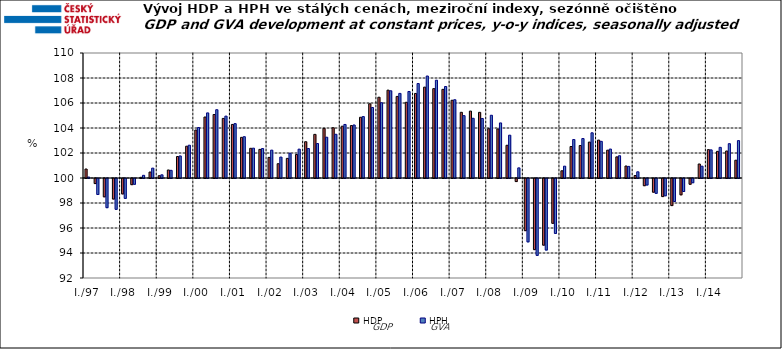
| Category | HDP

 | HPH

 |
|---|---|---|
| I./97 | 100.719 | 100.078 |
|  | 99.595 | 98.722 |
|  | 98.534 | 97.665 |
|  | 98.357 | 97.533 |
| I./98 | 98.767 | 98.409 |
|  | 99.507 | 99.536 |
|  | 100.056 | 100.215 |
|  | 100.477 | 100.79 |
| I./99 | 100.184 | 100.255 |
|  | 100.641 | 100.613 |
|  | 101.719 | 101.764 |
|  | 102.543 | 102.623 |
| I./00 | 103.839 | 104.038 |
|  | 104.879 | 105.209 |
|  | 105.081 | 105.463 |
|  | 104.766 | 104.949 |
| I./01 | 104.286 | 104.349 |
|  | 103.251 | 103.304 |
|  | 102.376 | 102.387 |
|  | 102.289 | 102.357 |
| I./02 | 101.649 | 102.23 |
|  | 101.143 | 101.673 |
|  | 101.57 | 101.981 |
|  | 101.879 | 102.308 |
| I./03 | 102.903 | 102.359 |
|  | 103.49 | 102.756 |
|  | 103.973 | 103.265 |
|  | 104.02 | 103.498 |
| I./04 | 104.144 | 104.283 |
|  | 104.194 | 104.242 |
|  | 104.858 | 104.915 |
|  | 105.936 | 105.641 |
| I./05 | 106.461 | 106.023 |
|  | 107.028 | 106.978 |
|  | 106.527 | 106.768 |
|  | 106.058 | 106.921 |
| I./06 | 106.765 | 107.557 |
|  | 107.271 | 108.159 |
|  | 107.149 | 107.824 |
|  | 107.092 | 107.32 |
| I./07 | 106.219 | 106.262 |
|  | 105.256 | 104.989 |
|  | 105.353 | 104.776 |
|  | 105.253 | 104.762 |
| I./08 | 103.944 | 105.02 |
|  | 103.926 | 104.405 |
|  | 102.618 | 103.426 |
|  | 99.755 | 100.81 |
| I./09 | 95.828 | 94.929 |
|  | 94.31 | 93.851 |
|  | 94.667 | 94.276 |
|  | 96.414 | 95.606 |
| I./10 | 100.577 | 100.947 |
|  | 102.519 | 103.079 |
|  | 102.598 | 103.157 |
|  | 102.874 | 103.616 |
| I./11 | 103.033 | 102.931 |
|  | 102.227 | 102.316 |
|  | 101.692 | 101.781 |
|  | 100.959 | 100.93 |
| I./12 | 100.2 | 100.496 |
|  | 99.425 | 99.48 |
|  | 98.904 | 98.813 |
|  | 98.554 | 98.618 |
| I./13 | 97.833 | 98.157 |
|  | 98.694 | 98.96 |
|  | 99.541 | 99.662 |
|  | 101.121 | 100.945 |
| I./14 | 102.27 | 102.25 |